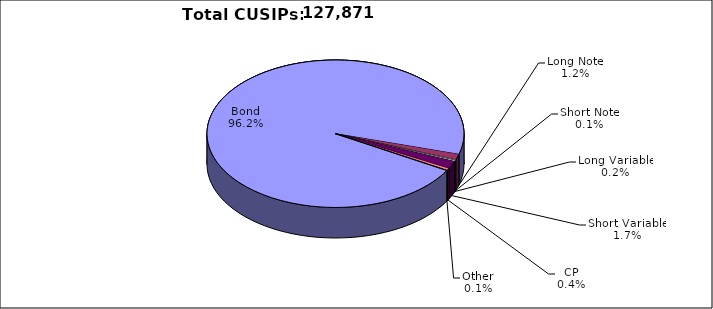
| Category | CUSIPs |
|---|---|
| Bond | 122979 |
| Long Note | 1594 |
| Short Note | 179 |
| Long Variable | 308 |
| Short Variable | 2169 |
| CP | 541 |
| Other | 101 |